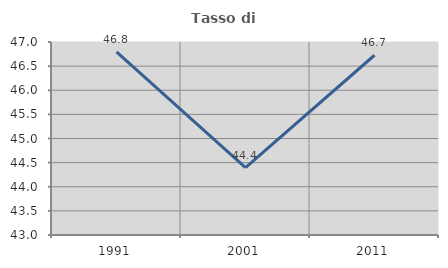
| Category | Tasso di occupazione   |
|---|---|
| 1991.0 | 46.797 |
| 2001.0 | 44.396 |
| 2011.0 | 46.725 |